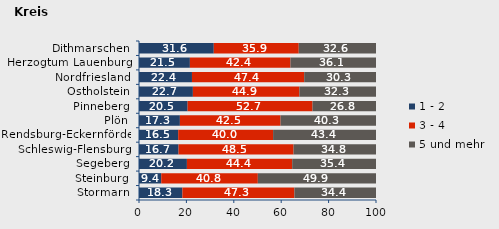
| Category | 1 - 2 | 3 - 4 | 5 und mehr |
|---|---|---|---|
| Stormarn | 18.308 | 47.264 | 34.428 |
| Steinburg | 9.384 | 40.762 | 49.853 |
| Segeberg | 20.216 | 44.422 | 35.362 |
| Schleswig-Flensburg | 16.691 | 48.529 | 34.779 |
| Rendsburg-Eckernförde | 16.535 | 40.045 | 43.42 |
| Plön | 17.254 | 42.486 | 40.26 |
| Pinneberg | 20.516 | 52.71 | 26.774 |
| Ostholstein | 22.74 | 44.932 | 32.329 |
| Nordfriesland | 22.351 | 47.351 | 30.298 |
| Herzogtum Lauenburg | 21.474 | 42.436 | 36.09 |
| Dithmarschen | 31.556 | 35.852 | 32.593 |